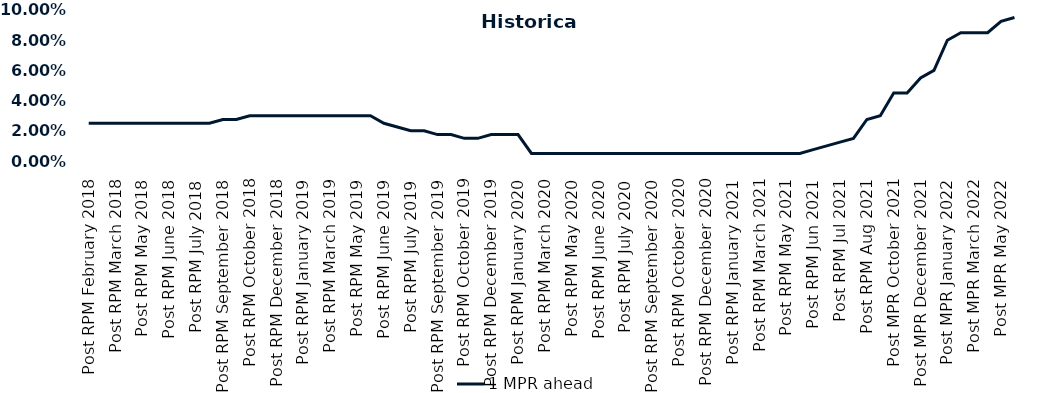
| Category | 1 MPR ahead |
|---|---|
| Post RPM February 2018 | 0.025 |
| Pre RPM March 2018 | 0.025 |
| Post RPM March 2018 | 0.025 |
| Pre RPM May 2018 | 0.025 |
| Post RPM May 2018 | 0.025 |
| Pre RPM June 2018 | 0.025 |
| Post RPM June 2018 | 0.025 |
| Pre RPM July 2018 | 0.025 |
| Post RPM July 2018 | 0.025 |
| Pre RPM September 2018 | 0.025 |
| Post RPM September 2018 | 0.028 |
| Pre RPM October 2018 | 0.028 |
| Post RPM October 2018 | 0.03 |
| Pre RPM December 2018 | 0.03 |
| Post RPM December 2018 | 0.03 |
| Pre RPM January 2019 | 0.03 |
| Post RPM January 2019 | 0.03 |
| Pre RPM March 2019 | 0.03 |
| Post RPM March 2019 | 0.03 |
| Pre RPM May 2019 | 0.03 |
| Post RPM May 2019 | 0.03 |
| Pre RPM June 2019 | 0.03 |
| Post RPM June 2019 | 0.025 |
| Pre RPM July 2019 | 0.022 |
| Post RPM July 2019 | 0.02 |
| Pre RPM September 2019 | 0.02 |
| Post RPM September 2019 | 0.018 |
| Pre RPM October 2019 | 0.018 |
| Post RPM October 2019 | 0.015 |
| Pre RPM December 2019 | 0.015 |
| Post RPM December 2019 | 0.018 |
| Pre RPM January 2020 | 0.018 |
| Post RPM January 2020 | 0.018 |
| Pre RPM March 2020 | 0.005 |
| Post RPM March 2020 | 0.005 |
| Pre RPM May 2020 | 0.005 |
| Post RPM May 2020 | 0.005 |
| Pre RPM June 2020 | 0.005 |
| Post RPM June 2020 | 0.005 |
| Pre RPM July 2020 | 0.005 |
| Post RPM July 2020 | 0.005 |
| Pre RPM September 2020 | 0.005 |
| Post RPM September 2020 | 0.005 |
| Pre RPM October 2020 | 0.005 |
| Post RPM October 2020 | 0.005 |
| Pre RPM December 2020 | 0.005 |
|  Post RPM December 2020 | 0.005 |
| Pre RPM January 2021 | 0.005 |
| Post RPM January 2021 | 0.005 |
|  Pre RPM March 2021 | 0.005 |
|  Post RPM March 2021 | 0.005 |
|  Pre RPM May 2021 | 0.005 |
|  Post RPM May 2021 | 0.005 |
|  Pre RPM Jun 2021 | 0.005 |
|   Post RPM Jun 2021 | 0.008 |
| Pre RPM Jul 2021 | 0.01 |
|  Post RPM Jul 2021 | 0.012 |
| Pre RPM Aug 2021 | 0.015 |
|  Post RPM Aug 2021 | 0.028 |
| Pre MPR October 2021 | 0.03 |
| Post MPR October 2021 | 0.045 |
| Pre MPR December 2021 | 0.045 |
| Post MPR December 2021 | 0.055 |
| Pre MPR January 2022 | 0.06 |
| Post MPR January 2022 | 0.08 |
| Pre MPR March 2022 | 0.085 |
| Post MPR March 2022 | 0.085 |
| Pre MPR May 2022 | 0.085 |
| Post MPR May 2022 | 0.092 |
| Pre MPR June 2022 | 0.095 |